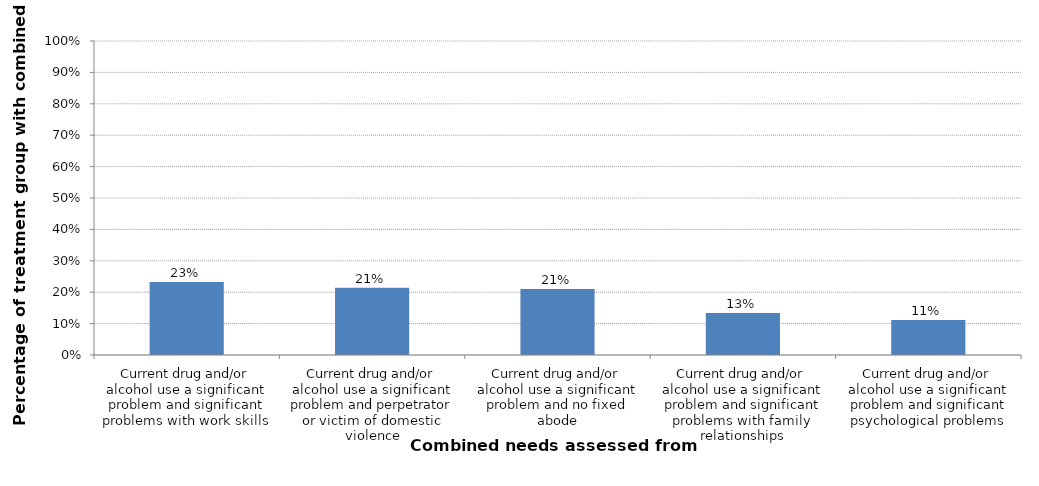
| Category | Percentage of treatment group with combined need |
|---|---|
| Current drug and/or alcohol use a significant problem and significant problems with work skills | 0.232 |
| Current drug and/or alcohol use a significant problem and perpetrator or victim of domestic violence | 0.214 |
| Current drug and/or alcohol use a significant problem and no fixed abode | 0.21 |
| Current drug and/or alcohol use a significant problem and significant problems with family relationships | 0.134 |
| Current drug and/or alcohol use a significant problem and significant psychological problems | 0.112 |